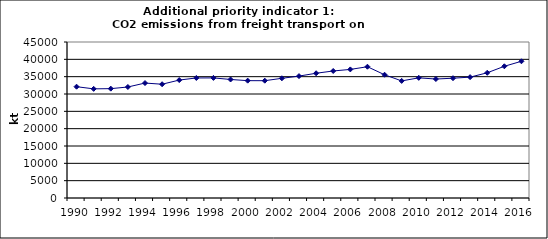
| Category | CO2 emissions from freight transport on road, kt  |
|---|---|
| 1990 | 32105.016 |
| 1991 | 31484.433 |
| 1992 | 31542.355 |
| 1993 | 32021.788 |
| 1994 | 33155.137 |
| 1995 | 32821.4 |
| 1996 | 34016.527 |
| 1997 | 34626.219 |
| 1998 | 34641.176 |
| 1999 | 34189.931 |
| 2000 | 33848.337 |
| 2001 | 33838.654 |
| 2002 | 34525.799 |
| 2003 | 35162.278 |
| 2004 | 35982.572 |
| 2005 | 36641.943 |
| 2006 | 37092.732 |
| 2007 | 37867.179 |
| 2008 | 35553.34 |
| 2009 | 33776.47 |
| 2010 | 34663.975 |
| 2011 | 34314.241 |
| 2012 | 34555.7 |
| 2013 | 34863.396 |
| 2014 | 36119.966 |
| 2015 | 37994.921 |
| 2016 | 39438.571 |